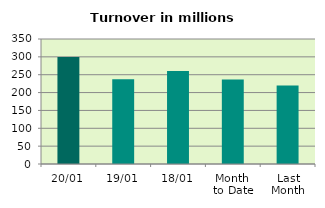
| Category | Series 0 |
|---|---|
| 20/01 | 299.742 |
| 19/01 | 237.607 |
| 18/01 | 260.594 |
| Month 
to Date | 236.833 |
| Last
Month | 219.947 |